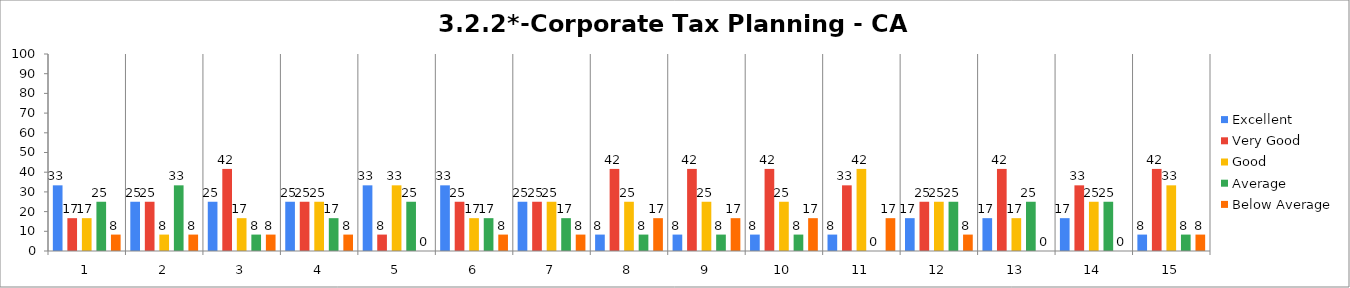
| Category | Excellent | Very Good | Good | Average | Below Average |
|---|---|---|---|---|---|
| 0 | 33.333 | 16.667 | 16.667 | 25 | 8.333 |
| 1 | 25 | 25 | 8.333 | 33.333 | 8.333 |
| 2 | 25 | 41.667 | 16.667 | 8.333 | 8.333 |
| 3 | 25 | 25 | 25 | 16.667 | 8.333 |
| 4 | 33.333 | 8.333 | 33.333 | 25 | 0 |
| 5 | 33.333 | 25 | 16.667 | 16.667 | 8.333 |
| 6 | 25 | 25 | 25 | 16.667 | 8.333 |
| 7 | 8.333 | 41.667 | 25 | 8.333 | 16.667 |
| 8 | 8.333 | 41.667 | 25 | 8.333 | 16.667 |
| 9 | 8.333 | 41.667 | 25 | 8.333 | 16.667 |
| 10 | 8.333 | 33.333 | 41.667 | 0 | 16.667 |
| 11 | 16.667 | 25 | 25 | 25 | 8.333 |
| 12 | 16.667 | 41.667 | 16.667 | 25 | 0 |
| 13 | 16.667 | 33.333 | 25 | 25 | 0 |
| 14 | 8.333 | 41.667 | 33.333 | 8.333 | 8.333 |